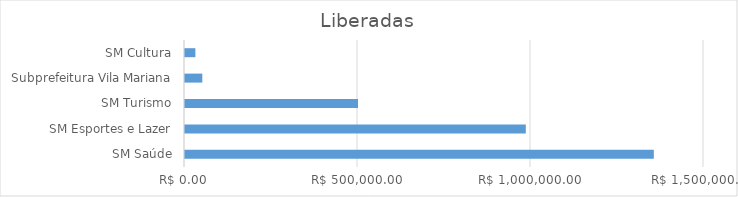
| Category | Series 0 |
|---|---|
| SM Saúde | 1355000 |
| SM Esportes e Lazer | 985000 |
| SM Turismo | 500000 |
| Subprefeitura Vila Mariana | 50000 |
| SM Cultura | 30000 |